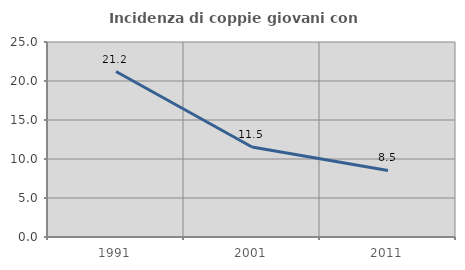
| Category | Incidenza di coppie giovani con figli |
|---|---|
| 1991.0 | 21.212 |
| 2001.0 | 11.543 |
| 2011.0 | 8.533 |